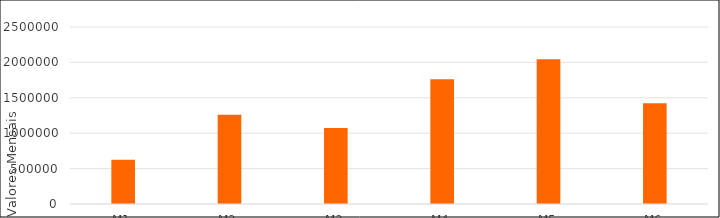
| Category | Series 0 | Series 1 | Series 2 |
|---|---|---|---|
| M1 |  | 623760.824 |  |
| M2 |  | 1259818.529 |  |
| M3 |  | 1074458.135 |  |
| M4 |  | 1763038.059 |  |
| M5 |  | 2042817.013 |  |
| M6 |  | 1422179.482 |  |